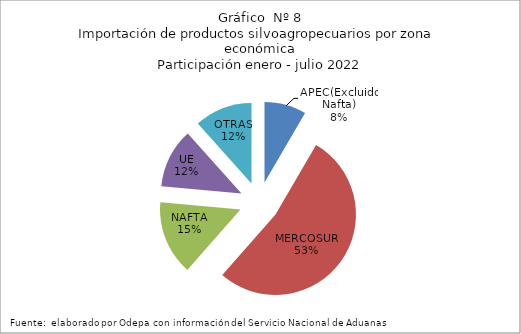
| Category | Series 0 |
|---|---|
| APEC(Excluido Nafta) | 472203.6 |
| MERCOSUR | 2980821.7 |
| NAFTA | 840053.125 |
| UE | 669357.195 |
| OTRAS | 653357.38 |